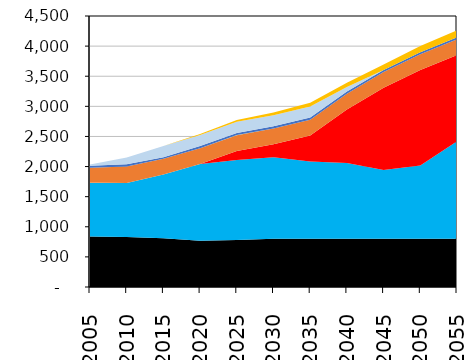
| Category | Series 0 | Series 2 | Series 3 | Series 4 | Series 1 | Series 5 | Series 6 | Series 7 | Series 8 | Series 9 | Series 10 | Series 11 | Series 12 | Series 13 |
|---|---|---|---|---|---|---|---|---|---|---|---|---|---|---|
| 2005.0 | 0 | 840.12 | 0 | 888.71 | 0 | 5.16 | 245.79 | 0 | 0 | 0.72 | 0 | 31.03 | 21.55 | 0 |
| 2010.0 | 0 | 832.23 | 0 | 893.76 | 0 | 0.73 | 275.39 | 0 | 0 | 0.72 | 0 | 36.33 | 110.37 | 0.02 |
| 2015.0 | 0 | 810.12 | 0 | 1058.19 | 0 | 0.51 | 261.01 | 0 | 0 | 0.72 | 0 | 25.04 | 184.36 | 3.24 |
| 2020.0 | 0 | 766.44 | 0 | 1274.9 | 0 | 0 | 261 | 0 | 0 | 0.72 | 0 | 36.33 | 184.36 | 17.33 |
| 2025.0 | 0 | 780.28 | 0 | 1326.82 | 153.26 | 0 | 261 | 0 | 0 | 0.72 | 0 | 36.33 | 184.36 | 31.4 |
| 2030.0 | 0 | 800.55 | 0 | 1355.43 | 213.68 | 0 | 261 | 0 | 0 | 0.72 | 0 | 36.33 | 184.36 | 45.49 |
| 2035.0 | 0 | 800.55 | 0 | 1283.23 | 431.79 | 0 | 261 | 0 | 0 | 0.72 | 0 | 36.33 | 184.36 | 59.56 |
| 2040.0 | 0 | 800.55 | 0 | 1260.4 | 888.31 | 0 | 261 | 0 | 0 | 0.72 | 0 | 36.33 | 71.81 | 73.65 |
| 2045.0 | 0 | 800.55 | 0 | 1142.96 | 1363.77 | 0 | 261.01 | 0 | 0 | 0.72 | 0 | 36.33 | 0 | 87.73 |
| 2050.0 | 0 | 800.55 | 0 | 1216.09 | 1586.11 | 0 | 261.01 | 0 | 0 | 0 | 0 | 36.33 | 0 | 101.8 |
| 2055.0 | 0 | 800.55 | 0 | 1616.65 | 1432.85 | 0 | 261.01 | 0 | 0 | 0 | 0 | 36.33 | 0 | 115.89 |